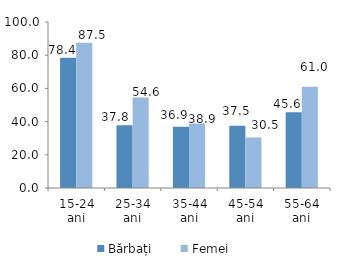
| Category | Bărbați | Femei |
|---|---|---|
| 15-24 ani | 78.417 | 87.5 |
| 25-34 ani | 37.765 | 54.59 |
| 35-44 ani | 36.856 | 38.853 |
| 45-54 ani | 37.506 | 30.466 |
| 55-64 ani | 45.609 | 60.996 |